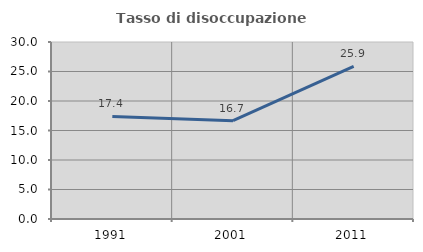
| Category | Tasso di disoccupazione giovanile  |
|---|---|
| 1991.0 | 17.377 |
| 2001.0 | 16.667 |
| 2011.0 | 25.85 |